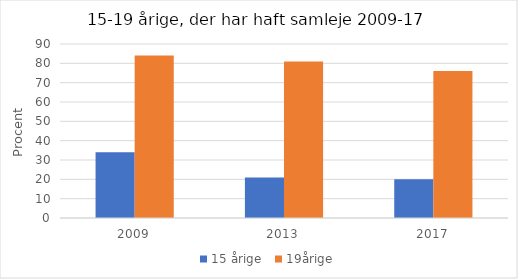
| Category | 15 årige | 19årige |
|---|---|---|
| 2009.0 | 34 | 84 |
| 2013.0 | 21 | 81 |
| 2017.0 | 20 | 76 |